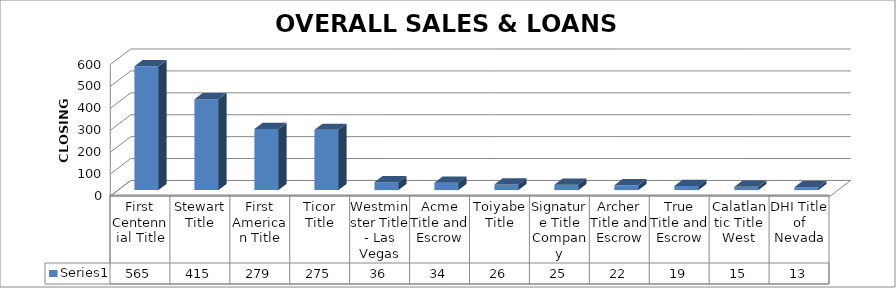
| Category | Series 0 |
|---|---|
| First Centennial Title | 565 |
| Stewart Title | 415 |
| First American Title | 279 |
| Ticor Title | 275 |
| Westminster Title - Las Vegas | 36 |
| Acme Title and Escrow | 34 |
| Toiyabe Title | 26 |
| Signature Title Company | 25 |
| Archer Title and Escrow | 22 |
| True Title and Escrow | 19 |
| Calatlantic Title West | 15 |
| DHI Title of Nevada | 13 |